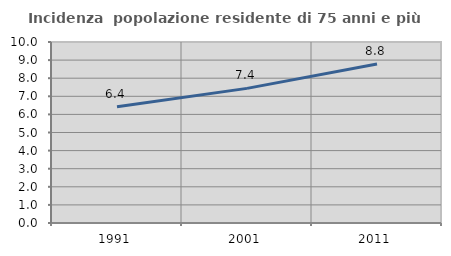
| Category | Incidenza  popolazione residente di 75 anni e più |
|---|---|
| 1991.0 | 6.423 |
| 2001.0 | 7.438 |
| 2011.0 | 8.789 |